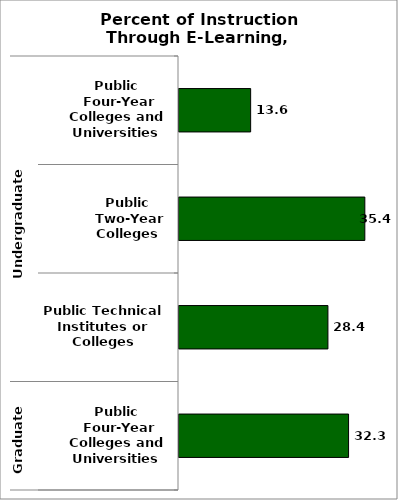
| Category | State |
|---|---|
| 0 | 13.646 |
| 1 | 35.398 |
| 2 | 28.367 |
| 3 | 32.299 |